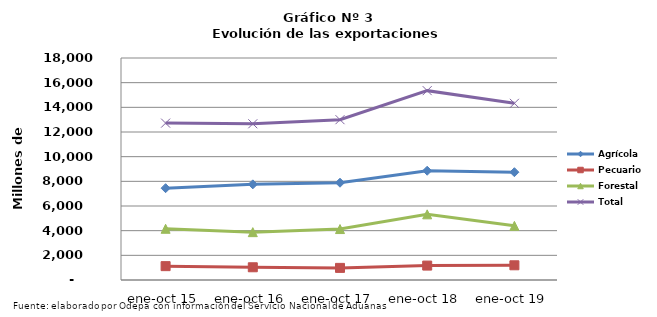
| Category | Agrícola | Pecuario | Forestal | Total |
|---|---|---|---|---|
| ene-oct 15 | 7444783 | 1123350 | 4151614 | 12719747 |
| ene-oct 16 | 7755137 | 1032246 | 3879871 | 12667254 |
| ene-oct 17 | 7887220 | 981856 | 4130154 | 12999230 |
| ene-oct 18 | 8860476 | 1168402 | 5323915 | 15352793 |
| ene-oct 19 | 8741379 | 1192547 | 4390853 | 14324779 |